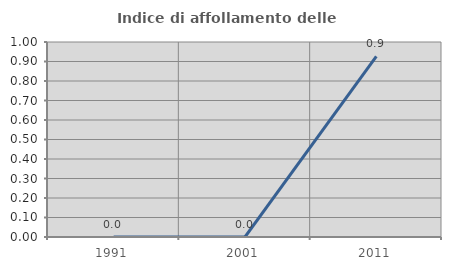
| Category | Indice di affollamento delle abitazioni  |
|---|---|
| 1991.0 | 0 |
| 2001.0 | 0 |
| 2011.0 | 0.926 |